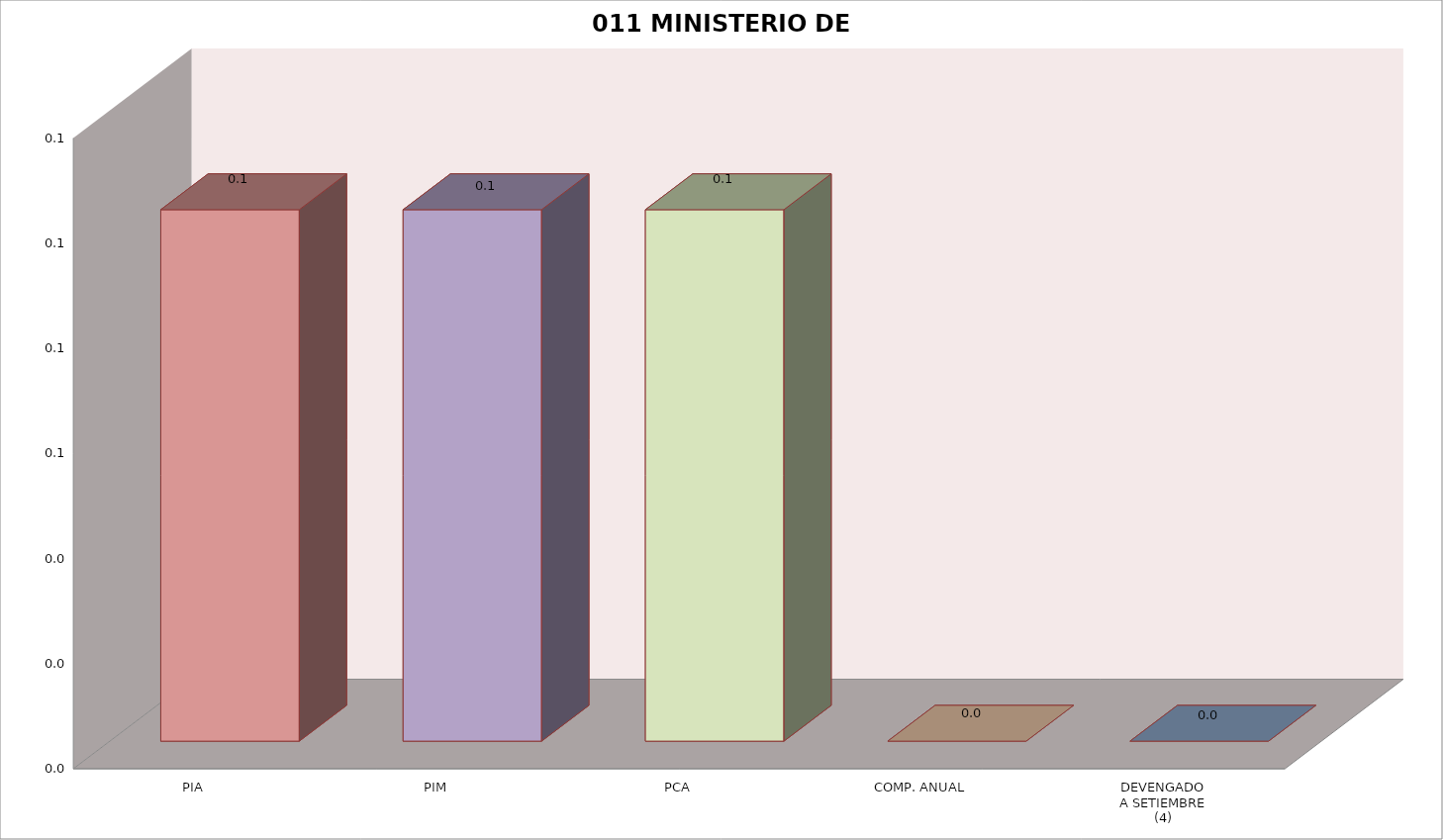
| Category | 011 MINISTERIO DE SALUD |
|---|---|
| PIA | 0.101 |
| PIM | 0.101 |
| PCA | 0.101 |
| COMP. ANUAL | 0 |
| DEVENGADO
A SETIEMBRE
(4) | 0 |